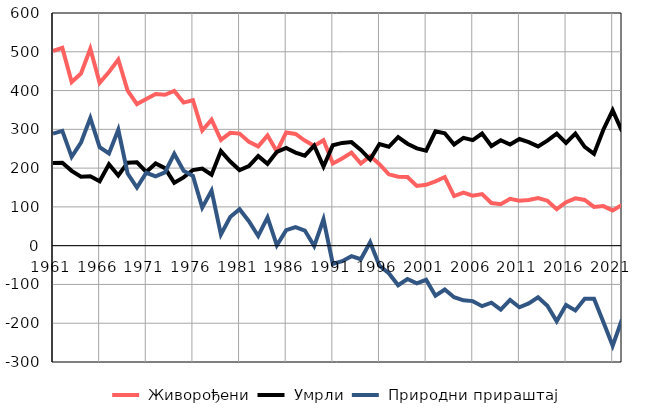
| Category |  Живорођени |  Умрли |  Природни прираштај |
|---|---|---|---|
| 1961.0 | 502 | 213 | 289 |
| 1962.0 | 510 | 214 | 296 |
| 1963.0 | 422 | 193 | 229 |
| 1964.0 | 444 | 178 | 266 |
| 1965.0 | 508 | 179 | 329 |
| 1966.0 | 420 | 166 | 254 |
| 1967.0 | 448 | 210 | 238 |
| 1968.0 | 480 | 181 | 299 |
| 1969.0 | 400 | 214 | 186 |
| 1970.0 | 365 | 215 | 150 |
| 1971.0 | 378 | 190 | 188 |
| 1972.0 | 391 | 212 | 179 |
| 1973.0 | 389 | 200 | 189 |
| 1974.0 | 399 | 162 | 237 |
| 1975.0 | 369 | 176 | 193 |
| 1976.0 | 375 | 195 | 180 |
| 1977.0 | 297 | 199 | 98 |
| 1978.0 | 325 | 183 | 142 |
| 1979.0 | 273 | 244 | 29 |
| 1980.0 | 291 | 217 | 74 |
| 1981.0 | 289 | 195 | 94 |
| 1982.0 | 268 | 205 | 63 |
| 1983.0 | 256 | 231 | 25 |
| 1984.0 | 284 | 211 | 73 |
| 1985.0 | 243 | 242 | 1 |
| 1986.0 | 292 | 252 | 40 |
| 1987.0 | 288 | 240 | 48 |
| 1988.0 | 271 | 232 | 39 |
| 1989.0 | 257 | 258 | -1 |
| 1990.0 | 272 | 204 | 68 |
| 1991.0 | 212 | 259 | -47 |
| 1992.0 | 225 | 265 | -40 |
| 1993.0 | 240 | 267 | -27 |
| 1994.0 | 212 | 247 | -35 |
| 1995.0 | 231 | 222 | 9 |
| 1996.0 | 210 | 262 | -52 |
| 1997.0 | 184 | 255 | -71 |
| 1998.0 | 178 | 280 | -102 |
| 1999.0 | 177 | 263 | -86 |
| 2000.0 | 154 | 251 | -97 |
| 2001.0 | 157 | 245 | -88 |
| 2002.0 | 166 | 295 | -129 |
| 2003.0 | 177 | 290 | -113 |
| 2004.0 | 128 | 261 | -133 |
| 2005.0 | 137 | 278 | -141 |
| 2006.0 | 129 | 272 | -143 |
| 2007.0 | 133 | 289 | -156 |
| 2008.0 | 110 | 257 | -147 |
| 2009.0 | 107 | 272 | -165 |
| 2010.0 | 121 | 261 | -140 |
| 2011.0 | 116 | 275 | -159 |
| 2012.0 | 118 | 267 | -149 |
| 2013.0 | 123 | 256 | -133 |
| 2014.0 | 116 | 271 | -155 |
| 2015.0 | 94 | 289 | -195 |
| 2016.0 | 112 | 265 | -153 |
| 2017.0 | 122 | 289 | -167 |
| 2018.0 | 118 | 255 | -137 |
| 2019.0 | 100 | 237 | -137 |
| 2020.0 | 102 | 299 | -197 |
| 2021.0 | 91 | 349 | -258 |
| 2022.0 | 105 | 295 | -190 |